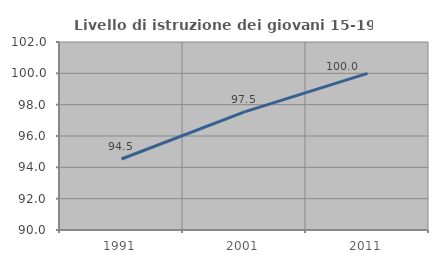
| Category | Livello di istruzione dei giovani 15-19 anni |
|---|---|
| 1991.0 | 94.531 |
| 2001.0 | 97.541 |
| 2011.0 | 100 |